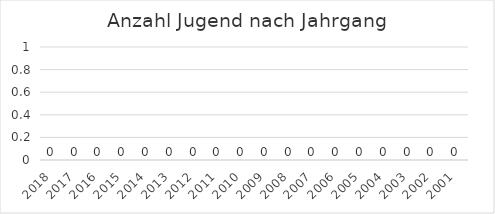
| Category | Series 0 |
|---|---|
| 2018.0 | 0 |
| 2017.0 | 0 |
| 2016.0 | 0 |
| 2015.0 | 0 |
| 2014.0 | 0 |
| 2013.0 | 0 |
| 2012.0 | 0 |
| 2011.0 | 0 |
| 2010.0 | 0 |
| 2009.0 | 0 |
| 2008.0 | 0 |
| 2007.0 | 0 |
| 2006.0 | 0 |
| 2005.0 | 0 |
| 2004.0 | 0 |
| 2003.0 | 0 |
| 2002.0 | 0 |
| 2001.0 | 0 |